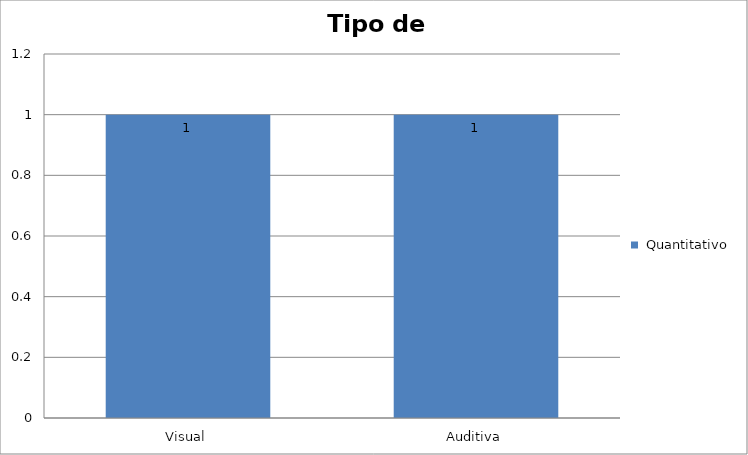
| Category |  Quantitativo |
|---|---|
| Visual | 1 |
| Auditiva | 1 |